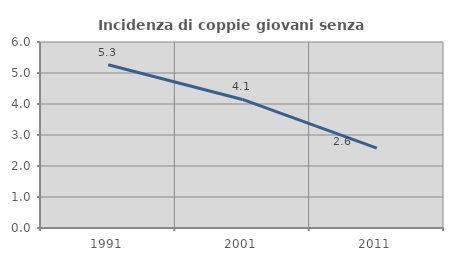
| Category | Incidenza di coppie giovani senza figli |
|---|---|
| 1991.0 | 5.269 |
| 2001.0 | 4.147 |
| 2011.0 | 2.579 |